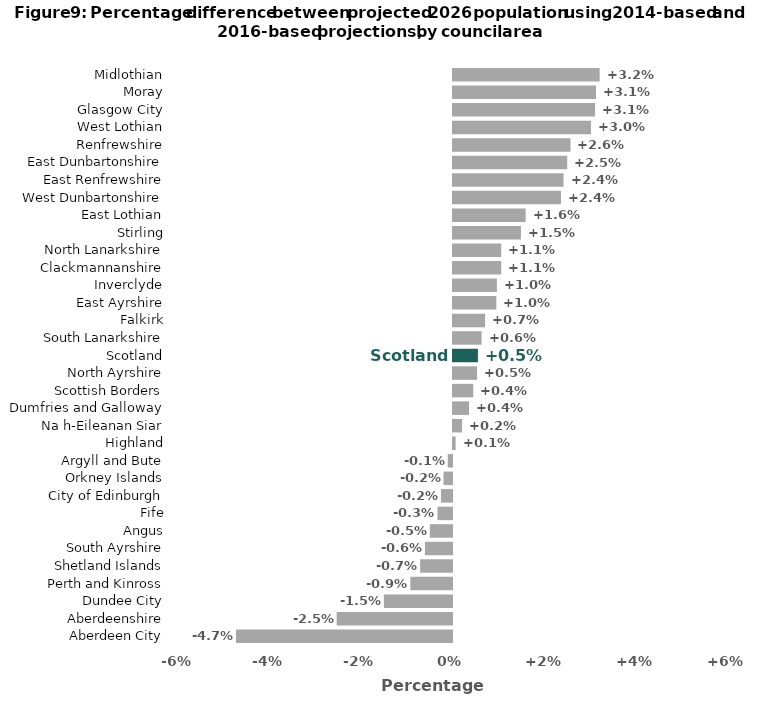
| Category | Series 0 |
|---|---|
| Aberdeen City | -4.748 |
| Aberdeenshire | -2.535 |
| Dundee City | -1.498 |
| Perth and Kinross | -0.916 |
| Shetland Islands | -0.701 |
| South Ayrshire | -0.595 |
| Angus | -0.488 |
| Fife | -0.319 |
| City of Edinburgh | -0.243 |
| Orkney Islands | -0.186 |
| Argyll and Bute | -0.094 |
| Highland | 0.058 |
| Na h-Eileanan Siar | 0.199 |
| Dumfries and Galloway | 0.352 |
| Scottish Borders | 0.446 |
| North Ayrshire | 0.529 |
| Scotland | 0.548 |
| South Lanarkshire | 0.629 |
| Falkirk | 0.706 |
| East Ayrshire | 0.952 |
| Inverclyde | 0.965 |
| Clackmannanshire | 1.06 |
| North Lanarkshire | 1.06 |
| Stirling | 1.493 |
| East Lothian | 1.596 |
| West Dunbartonshire | 2.373 |
| East Renfrewshire | 2.429 |
| East Dunbartonshire | 2.51 |
| Renfrewshire | 2.582 |
| West Lothian | 3.032 |
| Glasgow City | 3.122 |
| Moray | 3.143 |
| Midlothian | 3.223 |